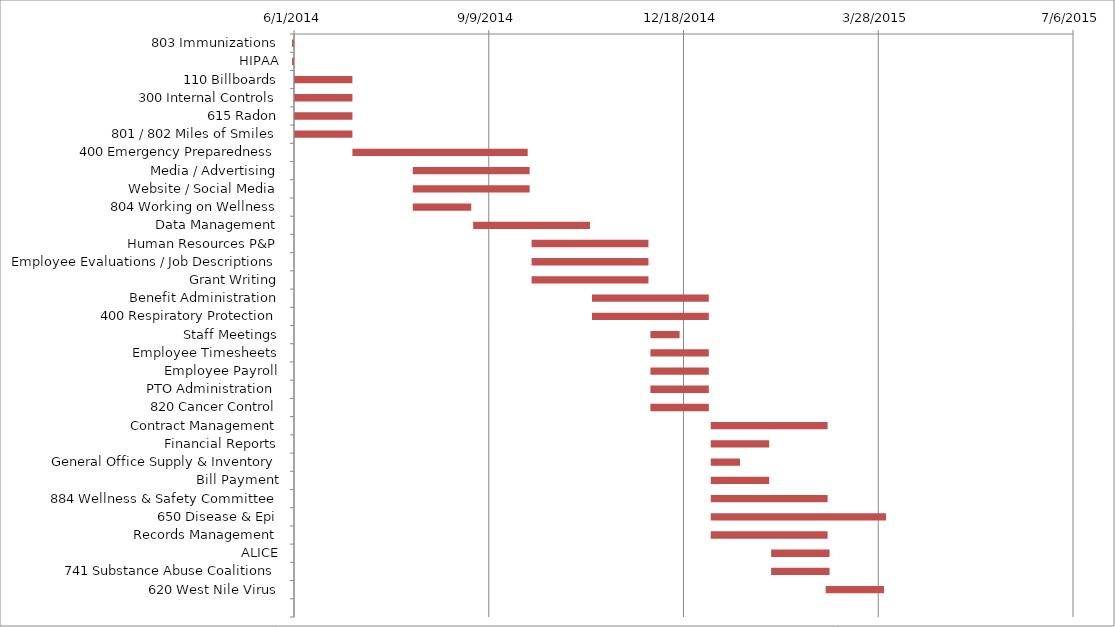
| Category | Series 0 | Series 1 |
|---|---|---|
| 803 Immunizations | 5/1/14 | 30 |
| HIPAA | 5/1/14 | 30 |
| 110 Billboards | 6/1/14 | 30 |
| 300 Internal Controls | 6/1/14 | 30 |
| 615 Radon | 6/1/14 | 30 |
| 801 / 802 Miles of Smiles | 6/1/14 | 30 |
| 400 Emergency Preparedness | 7/1/14 | 90 |
| Media / Advertising | 8/1/14 | 60 |
| Website / Social Media | 8/1/14 | 60 |
| 804 Working on Wellness | 8/1/14 | 30 |
| Data Management | 9/1/14 | 60 |
| Human Resources P&P | 10/1/14 | 60 |
| Employee Evaluations / Job Descriptions | 10/1/14 | 60 |
| Grant Writing | 10/1/14 | 60 |
| Benefit Administration | 11/1/14 | 60 |
| 400 Respiratory Protection | 11/1/14 | 60 |
| Staff Meetings | 12/1/14 | 15 |
| Employee Timesheets | 12/1/14 | 30 |
| Employee Payroll | 12/1/14 | 30 |
| PTO Administration  | 12/1/14 | 30 |
| 820 Cancer Control | 12/1/14 | 30 |
| Contract Management | 1/1/15 | 60 |
| Financial Reports | 1/1/15 | 30 |
| General Office Supply & Inventory | 1/1/15 | 15 |
| Bill Payment | 1/1/15 | 30 |
| 884 Wellness & Safety Committee | 1/1/15 | 60 |
| 650 Disease & Epi | 1/1/15 | 90 |
| Records Management | 1/1/15 | 60 |
| ALICE | 2/1/15 | 30 |
| 741 Substance Abuse Coalitions | 2/1/15 | 30 |
| 620 West Nile Virus | 3/1/15 | 30 |